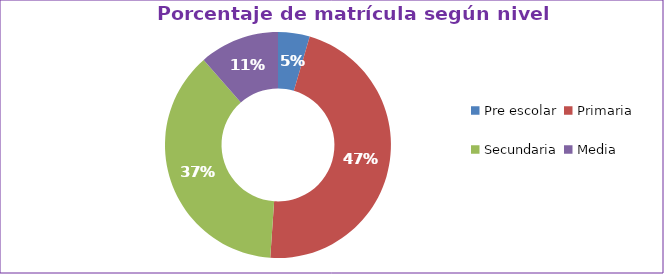
| Category | Series 0 |
|---|---|
| Pre escolar | 0.045 |
| Primaria | 0.466 |
| Secundaria | 0.375 |
| Media | 0.114 |